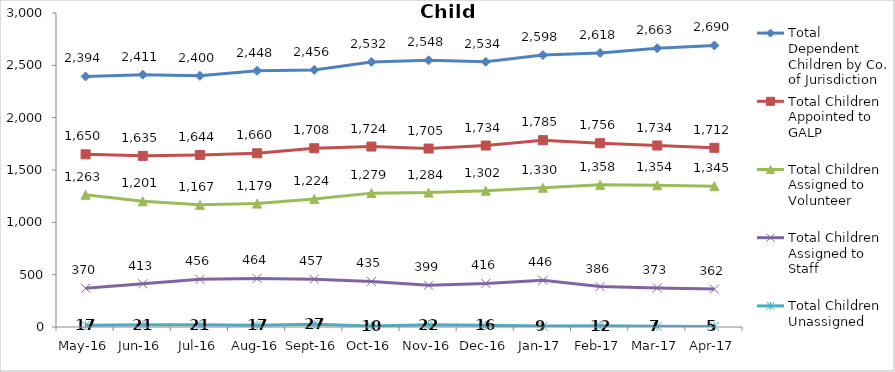
| Category | Total Dependent Children by Co. of Jurisdiction | Total Children Appointed to GALP | Total Children Assigned to Volunteer | Total Children Assigned to Staff | Total Children Unassigned |
|---|---|---|---|---|---|
| May-16 | 2394 | 1650 | 1263 | 370 | 17 |
| Jun-16 | 2411 | 1635 | 1201 | 413 | 21 |
| Jul-16 | 2400 | 1644 | 1167 | 456 | 21 |
| Aug-16 | 2448 | 1660 | 1179 | 464 | 17 |
| Sep-16 | 2456 | 1708 | 1224 | 457 | 27 |
| Oct-16 | 2532 | 1724 | 1279 | 435 | 10 |
| Nov-16 | 2548 | 1705 | 1284 | 399 | 22 |
| Dec-16 | 2534 | 1734 | 1302 | 416 | 16 |
| Jan-17 | 2598 | 1785 | 1330 | 446 | 9 |
| Feb-17 | 2618 | 1756 | 1358 | 386 | 12 |
| Mar-17 | 2663 | 1734 | 1354 | 373 | 7 |
| Apr-17 | 2690 | 1712 | 1345 | 362 | 5 |